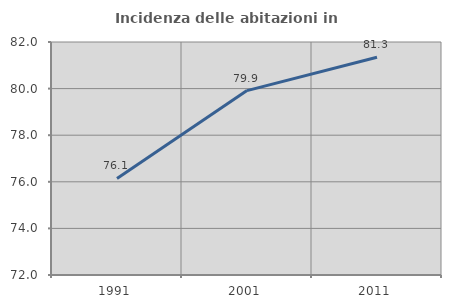
| Category | Incidenza delle abitazioni in proprietà  |
|---|---|
| 1991.0 | 76.145 |
| 2001.0 | 79.915 |
| 2011.0 | 81.345 |